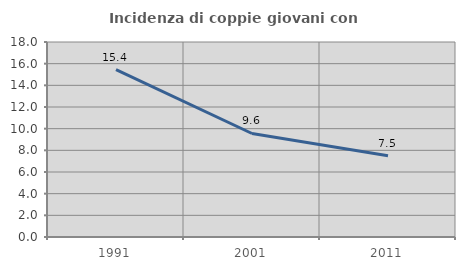
| Category | Incidenza di coppie giovani con figli |
|---|---|
| 1991.0 | 15.449 |
| 2001.0 | 9.555 |
| 2011.0 | 7.5 |